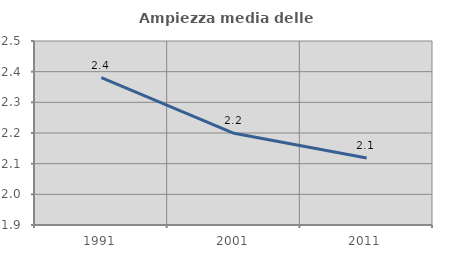
| Category | Ampiezza media delle famiglie |
|---|---|
| 1991.0 | 2.38 |
| 2001.0 | 2.199 |
| 2011.0 | 2.118 |